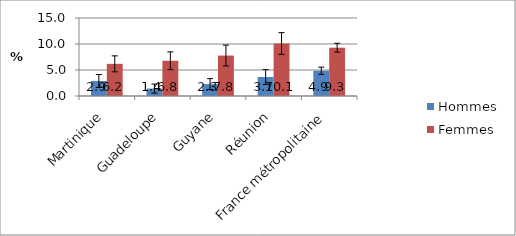
| Category | Hommes | Femmes |
|---|---|---|
| Martinique | 2.891 | 6.184 |
| Guadeloupe | 1.429 | 6.777 |
| Guyane | 2.285 | 7.777 |
| Réunion | 3.651 | 10.091 |
| France métropolitaine | 4.86 | 9.29 |